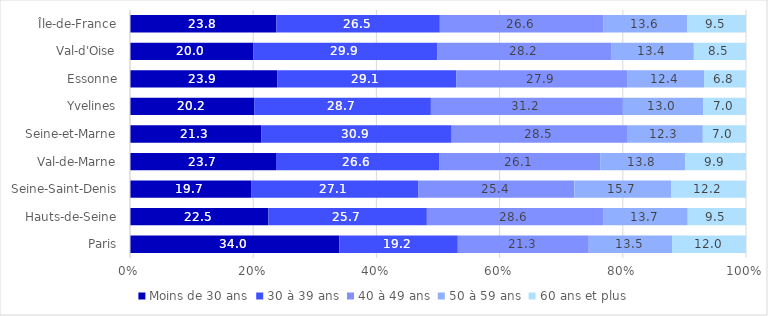
| Category | Moins de 30 ans | 30 à 39 ans | 40 à 49 ans | 50 à 59 ans | 60 ans et plus |
|---|---|---|---|---|---|
| Paris | 33.99 | 19.227 | 21.257 | 13.525 | 12.002 |
| Hauts-de-Seine | 22.47 | 25.724 | 28.609 | 13.739 | 9.458 |
| Seine-Saint-Denis | 19.652 | 27.114 | 25.367 | 15.696 | 12.171 |
| Val-de-Marne | 23.704 | 26.552 | 26.07 | 13.802 | 9.873 |
| Seine-et-Marne | 21.283 | 30.938 | 28.461 | 12.308 | 7.009 |
| Yvelines | 20.154 | 28.694 | 31.165 | 13.025 | 6.963 |
| Essonne | 23.89 | 29.056 | 27.851 | 12.39 | 6.812 |
| Val-d'Oise | 19.997 | 29.867 | 28.232 | 13.441 | 8.463 |
| Île-de-France | 23.781 | 26.514 | 26.584 | 13.62 | 9.5 |